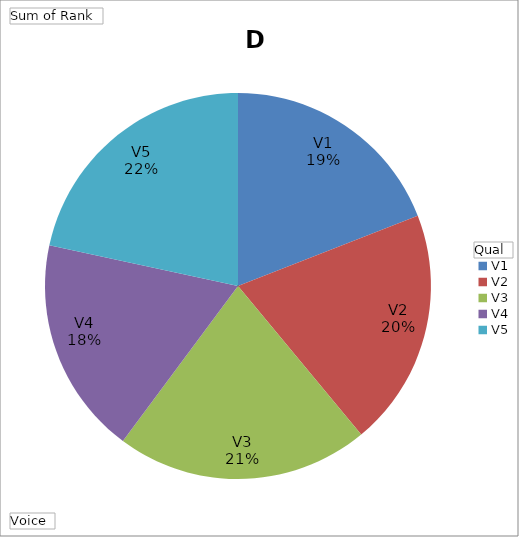
| Category | D | E | F | G |
|---|---|---|---|---|
| V1 | 45 | 48 | 56 | 55 |
| V2 | 47 | 49 | 54 | 47 |
| V3 | 50 | 48 | 49 | 47 |
| V4 | 43 | 46 | 56 | 48 |
| V5 | 51 | 50 | 54 | 49 |